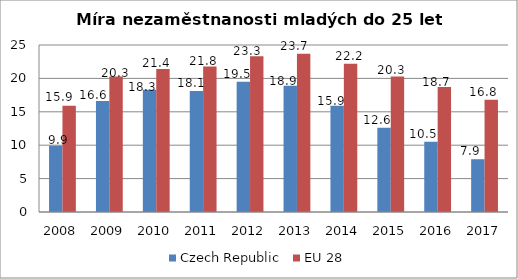
| Category | Czech Republic | EU 28 |
|---|---|---|
| 2008 | 9.9 | 15.9 |
| 2009 | 16.6 | 20.3 |
| 2010 | 18.3 | 21.4 |
| 2011 | 18.1 | 21.8 |
| 2012 | 19.5 | 23.3 |
| 2013 | 18.9 | 23.7 |
| 2014 | 15.9 | 22.2 |
| 2015 | 12.6 | 20.3 |
| 2016 | 10.5 | 18.7 |
| 2017 | 7.9 | 16.8 |